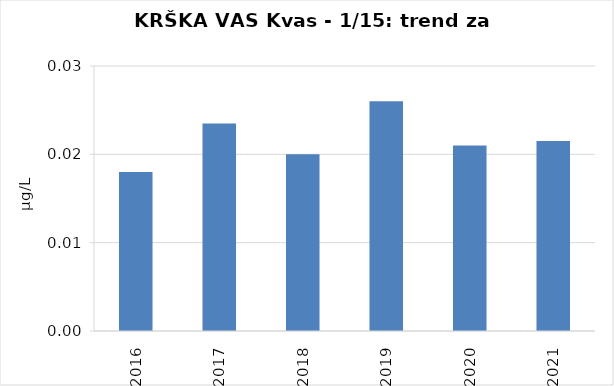
| Category | Vsota |
|---|---|
| 2016 | 0.018 |
| 2017 | 0.024 |
| 2018 | 0.02 |
| 2019 | 0.026 |
| 2020 | 0.021 |
| 2021 | 0.022 |